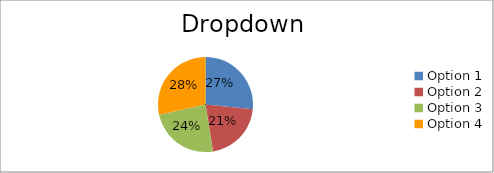
| Category | Options |
|---|---|
| Option 1 | 42 |
| Option 2 | 33 |
| Option 3 | 38 |
| Option 4 | 45 |